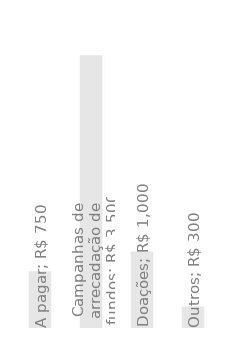
| Category | Receita Anual |
|---|---|
| A pagar | 750 |
| Campanhas de arrecadação de fundos | 3500 |
| Doações | 1000 |
| Outros | 300 |